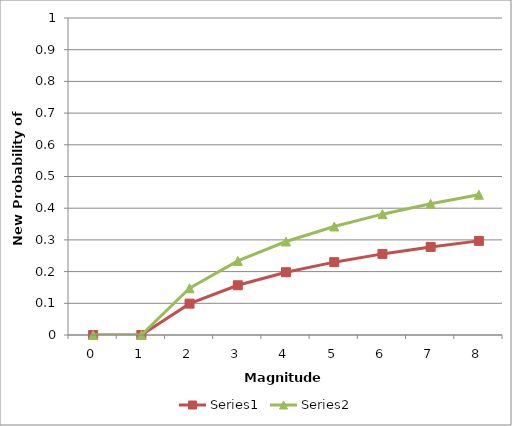
| Category | Series 1 | Series 2 |
|---|---|---|
| 0.0 | 0 | 0 |
| 1.0 | 0 | 0 |
| 2.0 | 0.099 | 0.147 |
| 3.0 | 0.157 | 0.234 |
| 4.0 | 0.198 | 0.295 |
| 5.0 | 0.23 | 0.342 |
| 6.0 | 0.256 | 0.381 |
| 7.0 | 0.278 | 0.414 |
| 8.0 | 0.297 | 0.442 |